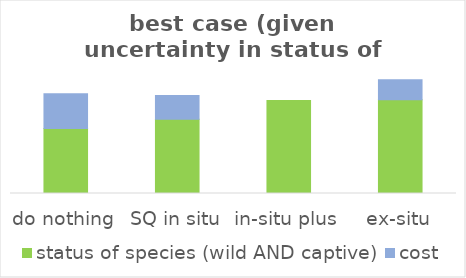
| Category | status of species (wild AND captive) | cost |
|---|---|---|
| do nothing | 0.429 | 0.231 |
| SQ in situ | 0.49 | 0.158 |
| in-situ plus | 0.615 | 0 |
| ex-situ | 0.62 | 0.132 |